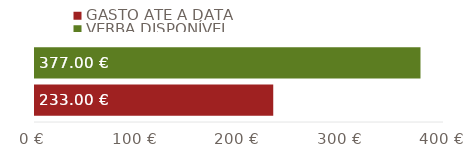
| Category | GASTO ATÉ À DATA | VERBA DISPONÍVEL |
|---|---|---|
| TOTAIS | 233 | 377 |